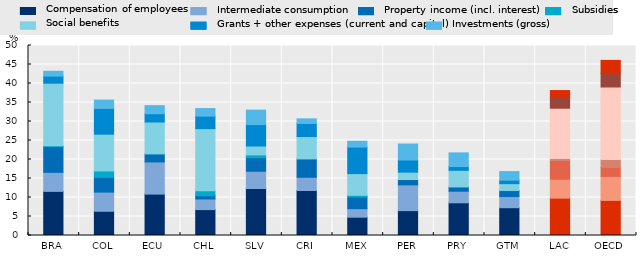
| Category | Compensation of Employees | Intermediate consumption | Property income (incl. interest) | Subsidies | Social Benefits | Grants + other expenses (current and capital) | Investments (gross) |
|---|---|---|---|---|---|---|---|
| BRA | 11.615 | 5.009 | 6.765 | 0.201 | 16.495 | 1.865 | 1.262 |
| COL | 6.377 | 5.04 | 3.88 | 1.7 | 9.661 | 6.787 | 2.192 |
| ECU | 10.895 | 8.465 | 2.112 | 0 | 8.39 | 2.181 | 2.132 |
| CHL | 6.816 | 2.798 | 0.853 | 1.29 | 16.364 | 3.287 | 1.997 |
| SLV | 12.371 | 4.534 | 3.556 | 0.754 | 2.329 | 5.655 | 3.799 |
| CRI | 11.839 | 3.483 | 4.836 | 0 | 5.883 | 3.44 | 1.213 |
| MEX | 4.815 | 2.242 | 3.08 | 0.44 | 5.71 | 6.977 | 1.536 |
| PER | 6.544 | 6.777 | 1.397 | 0 | 1.953 | 3.199 | 4.211 |
| PRY | 8.606 | 3.045 | 1.126 | 0 | 4.377 | 0.995 | 3.591 |
| GTM | 7.315 | 2.934 | 1.549 | 0.065 | 1.776 | 0.917 | 2.266 |
| LAC | 9.829 | 4.983 | 4.939 | 0.489 | 13.258 | 2.817 | 1.827 |
| OECD | 9.233 | 6.321 | 2.357 | 2.094 | 19.073 | 3.599 | 3.403 |